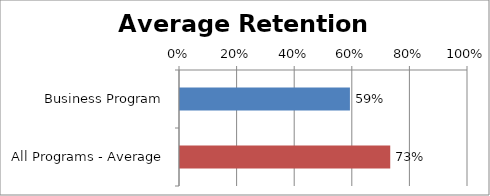
| Category | RetentionRate |
|---|---|
| Business Program | 0.59 |
| All Programs - Average | 0.73 |